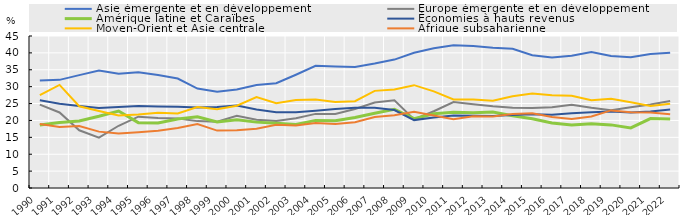
| Category | Asie émergente et en développement | Europe émergente et en développement | Amérique latine et Caraïbes | Économies à hauts revenus | Moyen-Orient et Asie centrale | Afrique subsaharienne |
|---|---|---|---|---|---|---|
| 1990.0 | 31.824 | 24.688 | 18.649 | 25.974 | 27.479 | 18.915 |
| 1991.0 | 32.017 | 22.367 | 19.376 | 24.957 | 30.516 | 18.031 |
| 1992.0 | 33.411 | 17.089 | 19.85 | 24.254 | 24.188 | 18.366 |
| 1993.0 | 34.795 | 14.885 | 21.226 | 23.653 | 22.821 | 16.689 |
| 1994.0 | 33.792 | 18.426 | 22.784 | 24.015 | 21.49 | 16.12 |
| 1995.0 | 34.234 | 21.108 | 19.345 | 24.251 | 21.772 | 16.513 |
| 1996.0 | 33.441 | 20.722 | 19.245 | 24.145 | 22.287 | 16.97 |
| 1997.0 | 32.421 | 20.586 | 20.416 | 24.076 | 22.084 | 17.771 |
| 1998.0 | 29.429 | 19.801 | 21.055 | 23.846 | 24.001 | 18.915 |
| 1999.0 | 28.522 | 19.622 | 19.521 | 24.001 | 23.335 | 16.998 |
| 2000.0 | 29.166 | 21.348 | 20.203 | 24.437 | 24.376 | 17.091 |
| 2001.0 | 30.513 | 20.224 | 19.502 | 23.261 | 26.941 | 17.538 |
| 2002.0 | 30.999 | 19.818 | 19.134 | 22.456 | 25.073 | 18.689 |
| 2003.0 | 33.526 | 20.665 | 18.796 | 22.391 | 26.061 | 18.53 |
| 2004.0 | 36.174 | 21.939 | 20.015 | 22.875 | 26.235 | 19.207 |
| 2005.0 | 35.947 | 21.917 | 19.919 | 23.357 | 25.494 | 18.982 |
| 2006.0 | 35.821 | 23.374 | 20.858 | 23.751 | 25.69 | 19.467 |
| 2007.0 | 36.84 | 25.281 | 22.152 | 23.722 | 28.757 | 21.042 |
| 2008.0 | 38.012 | 25.961 | 23.317 | 23.078 | 29.143 | 21.556 |
| 2009.0 | 40.052 | 20.318 | 20.541 | 20.104 | 30.446 | 22.533 |
| 2010.0 | 41.362 | 22.732 | 21.999 | 20.876 | 28.605 | 21.471 |
| 2011.0 | 42.251 | 25.461 | 22.392 | 21.447 | 26.236 | 20.37 |
| 2012.0 | 42.009 | 24.767 | 22.267 | 21.398 | 26.226 | 21.256 |
| 2013.0 | 41.52 | 24.17 | 22.497 | 21.301 | 25.849 | 21.185 |
| 2014.0 | 41.227 | 23.725 | 21.399 | 21.637 | 27.172 | 21.919 |
| 2015.0 | 39.28 | 23.711 | 20.49 | 21.831 | 27.973 | 22.109 |
| 2016.0 | 38.652 | 23.878 | 19.233 | 21.658 | 27.435 | 20.99 |
| 2017.0 | 39.183 | 24.653 | 18.651 | 22.098 | 27.324 | 20.436 |
| 2018.0 | 40.222 | 23.727 | 19.024 | 22.409 | 25.975 | 21.156 |
| 2019.0 | 39.07 | 23.032 | 18.685 | 22.642 | 26.402 | 22.973 |
| 2020.0 | 38.687 | 23.935 | 17.788 | 22.344 | 25.374 | 22.44 |
| 2021.0 | 39.702 | 24.699 | 20.554 | 22.65 | 24.298 | 22.362 |
| 2022.0 | 40.011 | 25.784 | 20.417 | 23.23 | 24.941 | 21.843 |